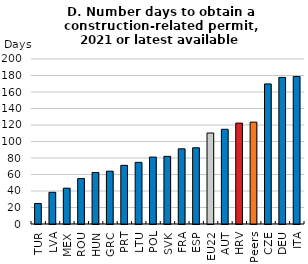
| Category | Days to obtain a construction-related permit |
|---|---|
| TUR | 24.8 |
| LVA | 38.4 |
| MEX | 43.4 |
| ROU | 55.1 |
| HUN | 62.4 |
| GRC | 64 |
| PRT | 71.1 |
| LTU | 74.7 |
| POL | 81.1 |
| SVK | 82 |
| FRA | 91.1 |
| ESP | 92.4 |
| EU22 | 110.268 |
| AUT | 114.8 |
| HRV | 122.3 |
| Peers | 123.45 |
| CZE | 169.8 |
| DEU | 177.7 |
| ITA | 178.8 |